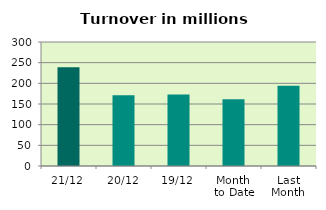
| Category | Series 0 |
|---|---|
| 21/12 | 238.735 |
| 20/12 | 171.234 |
| 19/12 | 172.824 |
| Month 
to Date | 161.328 |
| Last
Month | 193.997 |